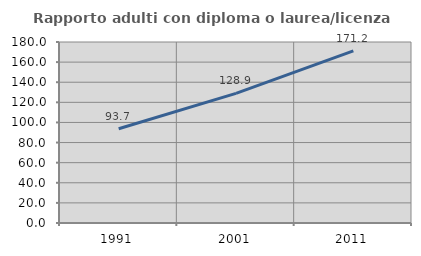
| Category | Rapporto adulti con diploma o laurea/licenza media  |
|---|---|
| 1991.0 | 93.713 |
| 2001.0 | 128.901 |
| 2011.0 | 171.224 |